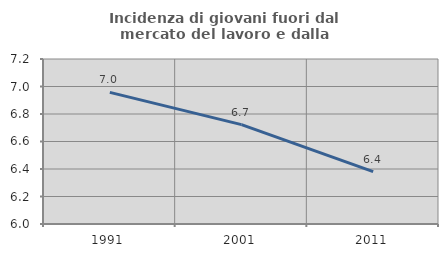
| Category | Incidenza di giovani fuori dal mercato del lavoro e dalla formazione  |
|---|---|
| 1991.0 | 6.957 |
| 2001.0 | 6.723 |
| 2011.0 | 6.381 |